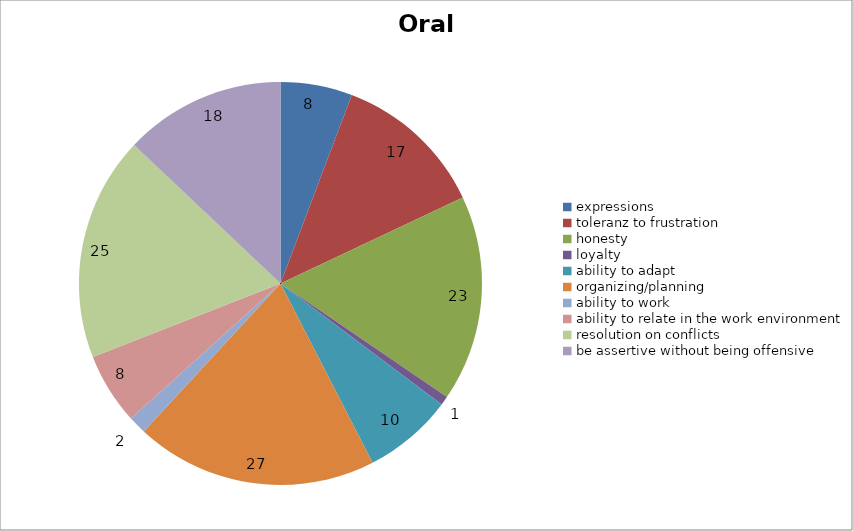
| Category | Oral |
|---|---|
| expressions | 8 |
| toleranz to frustration | 17 |
| honesty | 23 |
| loyalty | 1 |
| ability to adapt | 10 |
| organizing/planning | 27 |
| ability to work | 2 |
| ability to relate in the work environment | 8 |
| resolution on conflicts | 25 |
| be assertive without being offensive | 18 |